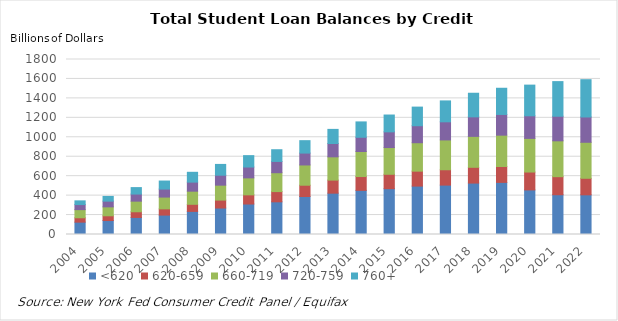
| Category | <620 | 620-659 | 660-719 | 720-759 | 760+ |
|---|---|---|---|---|---|
| 2004.0 | 127.02 | 45.05 | 83.64 | 52.07 | 38.24 |
| 2005.0 | 143.65 | 48.81 | 91.8 | 58.9 | 48.65 |
| 2006.0 | 175.44 | 58.4 | 109.19 | 72.93 | 66.42 |
| 2007.0 | 199.54 | 64.09 | 121.3 | 82.52 | 82.4 |
| 2008.0 | 237.51 | 73.01 | 135.01 | 93.21 | 101.07 |
| 2009.0 | 272.37 | 81.68 | 153.48 | 102.48 | 110.81 |
| 2010.0 | 313.57 | 94.33 | 174.6 | 111.56 | 117.1 |
| 2011.0 | 336.1 | 105.2 | 194.2 | 116.05 | 120.43 |
| 2012.0 | 390.67 | 116.17 | 208.38 | 122.19 | 127.74 |
| 2013.0 | 425.14 | 134.41 | 239.26 | 137.13 | 145.24 |
| 2014.0 | 453.88 | 142.26 | 257.37 | 146.63 | 157.95 |
| 2015.0 | 471.38 | 147.8 | 275.13 | 161.6 | 173 |
| 2016.0 | 497.83 | 153.75 | 292.39 | 174.82 | 191.58 |
| 2017.0 | 507.98 | 158.04 | 306.71 | 186.44 | 214.89 |
| 2018.0 | 528.86 | 162.28 | 318.09 | 200.82 | 242.8 |
| 2019.0 | 536.05 | 163.14 | 322.61 | 212.97 | 269.42 |
| 2020.0 | 458.38 | 184.1 | 346.11 | 232.4 | 315.51 |
| 2021.0 | 409.06 | 185.7 | 368.79 | 253 | 356.03 |
| 2022.0 | 408.03 | 170.19 | 370.44 | 260.1 | 383.5 |